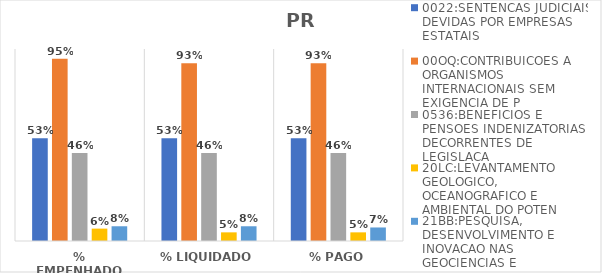
| Category | 0022:SENTENCAS JUDICIAIS DEVIDAS POR EMPRESAS ESTATAIS | 00OQ:CONTRIBUICOES A ORGANISMOS INTERNACIONAIS SEM EXIGENCIA DE P | 0536:BENEFICIOS E PENSOES INDENIZATORIAS DECORRENTES DE LEGISLACA | 20LC:LEVANTAMENTO GEOLOGICO, OCEANOGRAFICO E AMBIENTAL DO POTEN | 21BB:PESQUISA, DESENVOLVIMENTO E INOVACAO NAS GEOCIENCIAS E |
|---|---|---|---|---|---|
| % EMPENHADO | 0.535 | 0.95 | 0.459 | 0.065 | 0.077 |
| % LIQUIDADO | 0.535 | 0.926 | 0.459 | 0.045 | 0.077 |
| % PAGO | 0.535 | 0.926 | 0.459 | 0.045 | 0.07 |